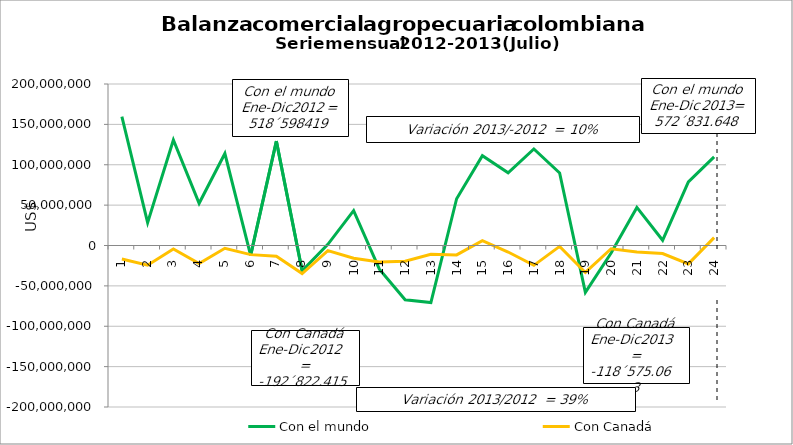
| Category | Con el mundo | Con Canadá |
|---|---|---|
| 0 | 159718841.64 | -16743061.08 |
| 1 | 28365041.12 | -24408092.93 |
| 2 | 130703974.8 | -4321192.91 |
| 3 | 52247918.23 | -22447313.99 |
| 4 | 113869717.7 | -3407221.29 |
| 5 | -12237480.38 | -11308433.72 |
| 6 | 129307528.98 | -13273850.65 |
| 7 | -31469442.96 | -34750281.54 |
| 8 | 1432914.69 | -6386375.53 |
| 9 | 43090007.69 | -15806964.71 |
| 10 | -29233824.97 | -20398723.05 |
| 11 | -67196777.37 | -19570903.87 |
| 12 | -70591672.64 | -10805710.52 |
| 13 | 57888002.76 | -11612110 |
| 14 | 111239208.87 | 6019768.53 |
| 15 | 90043885.64 | -8064504.91 |
| 16 | 119554876.57 | -24577729 |
| 17 | 89894947.57 | -1108755.31 |
| 18 | -58064700.6 | -33389913.98 |
| 19 | -9356718 | -3979085 |
| 20 | 47150533 | -8083947 |
| 21 | 6449335 | -9965993 |
| 22 | 78841099 | -22767520 |
| 23 | 109728576 | 9760437 |